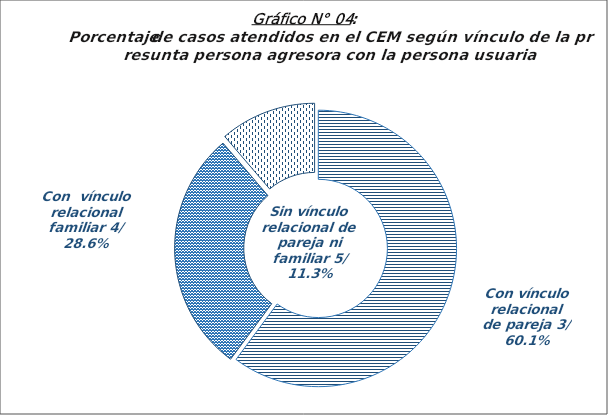
| Category | Series 0 |
|---|---|
| Con vínculo relacional de pareja 3/ | 486 |
| Con  vínculo  relacional  familiar 4/ | 231 |
| Sin vínculo relacional de pareja ni familiar 5/ | 91 |